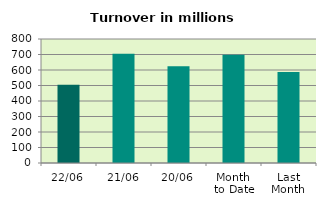
| Category | Series 0 |
|---|---|
| 22/06 | 504.147 |
| 21/06 | 705.364 |
| 20/06 | 623.867 |
| Month 
to Date | 698.417 |
| Last
Month | 587.249 |